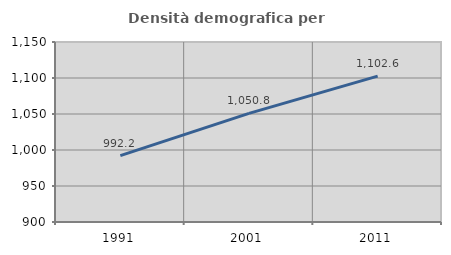
| Category | Densità demografica |
|---|---|
| 1991.0 | 992.155 |
| 2001.0 | 1050.811 |
| 2011.0 | 1102.625 |